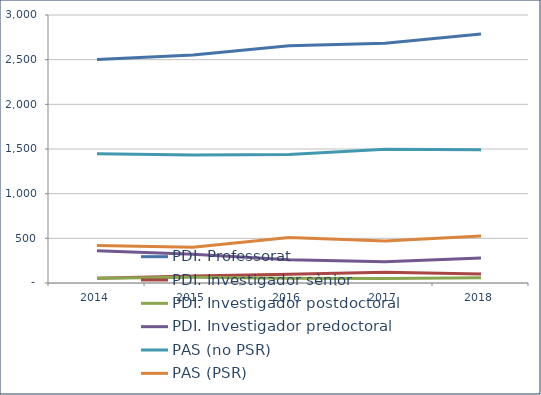
| Category | PDI. Professorat | PDI. Investigador sènior | PDI. Investigador postdoctoral | PDI. Investigador predoctoral | PAS (no PSR) | PAS (PSR) |
|---|---|---|---|---|---|---|
| 2014.0 | 2502 | 53 | 52 | 361 | 1446 | 419 |
| 2015.0 | 2552 | 79 | 63 | 321 | 1432 | 400 |
| 2016.0 | 2656 | 99 | 52 | 259 | 1438 | 508 |
| 2017.0 | 2684 | 121 | 50 | 238 | 1497 | 470 |
| 2018.0 | 2788 | 100 | 60 | 279 | 1492 | 526 |